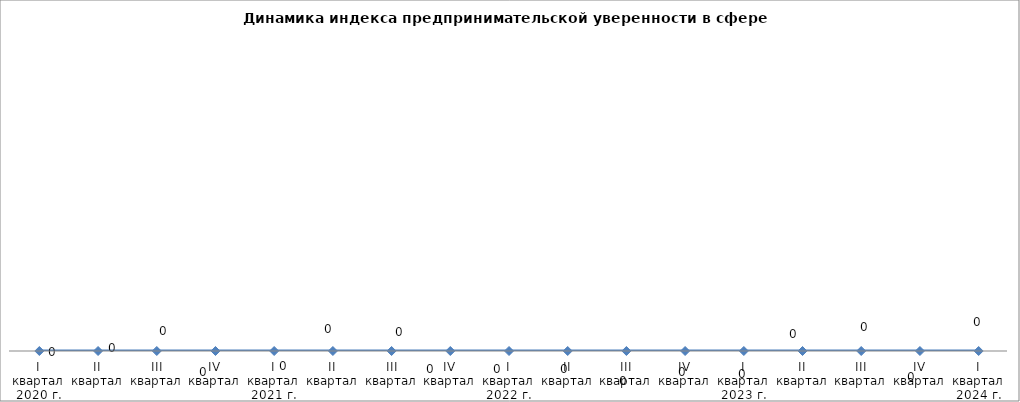
| Category | Series 0 |
|---|---|
| 0 | -8 |
| 1 | -40 |
| 2 | -9 |
| 3 | -19 |
| 4 | -8 |
| 5 | 3 |
| 6 | -1 |
| 7 | -10 |
| 8 | -7 |
| 9 | -7 |
| 10 | -4 |
| 11 | -9 |
| 12 | -6 |
| 13 | 2 |
| 14 | 1 |
| 15 | -4 |
| 16 | -2 |